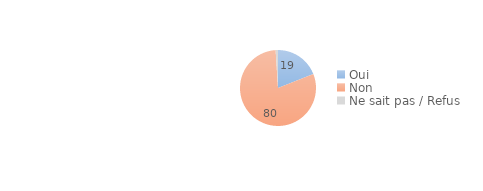
| Category | Series 0 |
|---|---|
| Oui | 19 |
| Non | 80 |
| Ne sait pas / Refus | 1 |